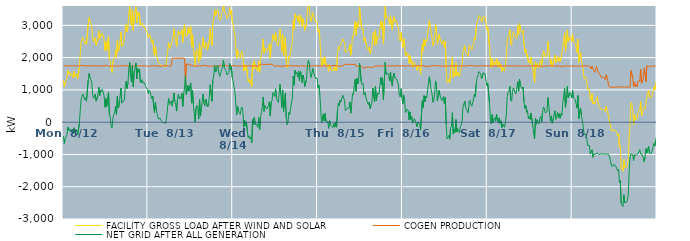
| Category | FACILITY GROSS LOAD AFTER WIND AND SOLAR | COGEN PRODUCTION | NET GRID AFTER ALL GENERATION |
|---|---|---|---|
|  Mon  8/12 | 1309 | 1745 | -436 |
|  Mon  8/12 | 1097 | 1756 | -659 |
|  Mon  8/12 | 1233 | 1739 | -506 |
|  Mon  8/12 | 1297 | 1753 | -456 |
|  Mon  8/12 | 1364 | 1751 | -387 |
|  Mon  8/12 | 1605 | 1754 | -149 |
|  Mon  8/12 | 1485 | 1740 | -255 |
|  Mon  8/12 | 1550 | 1755 | -205 |
|  Mon  8/12 | 1447 | 1754 | -307 |
|  Mon  8/12 | 1504 | 1738 | -234 |
|  Mon  8/12 | 1449 | 1746 | -297 |
|  Mon  8/12 | 1378 | 1738 | -360 |
|  Mon  8/12 | 1574 | 1745 | -171 |
|  Mon  8/12 | 1402 | 1738 | -336 |
|  Mon  8/12 | 1396 | 1743 | -347 |
|  Mon  8/12 | 1507 | 1741 | -234 |
|  Mon  8/12 | 1344 | 1742 | -398 |
|  Mon  8/12 | 1372 | 1745 | -373 |
|  Mon  8/12 | 1685 | 1742 | -57 |
|  Mon  8/12 | 2113 | 1745 | 368 |
|  Mon  8/12 | 2475 | 1762 | 713 |
|  Mon  8/12 | 2449 | 1757 | 692 |
|  Mon  8/12 | 2632 | 1756 | 876 |
|  Mon  8/12 | 2552 | 1744 | 808 |
|  Mon  8/12 | 2437 | 1738 | 699 |
|  Mon  8/12 | 2490 | 1735 | 755 |
|  Mon  8/12 | 2401 | 1752 | 649 |
|  Mon  8/12 | 2379 | 1731 | 648 |
|  Mon  8/12 | 3034 | 1739 | 1295 |
|  Mon  8/12 | 3244 | 1734 | 1510 |
|  Mon  8/12 | 3137 | 1745 | 1392 |
|  Mon  8/12 | 3065 | 1751 | 1314 |
|  Mon  8/12 | 2994 | 1746 | 1248 |
|  Mon  8/12 | 2605 | 1740 | 865 |
|  Mon  8/12 | 2485 | 1748 | 737 |
|  Mon  8/12 | 2539 | 1750 | 789 |
|  Mon  8/12 | 2618 | 1748 | 870 |
|  Mon  8/12 | 2380 | 1728 | 652 |
|  Mon  8/12 | 2384 | 1746 | 638 |
|  Mon  8/12 | 2571 | 1748 | 823 |
|  Mon  8/12 | 2830 | 1744 | 1086 |
|  Mon  8/12 | 2575 | 1750 | 825 |
|  Mon  8/12 | 2727 | 1743 | 984 |
|  Mon  8/12 | 2686 | 1746 | 940 |
|  Mon  8/12 | 2759 | 1739 | 1020 |
|  Mon  8/12 | 2764 | 1731 | 1033 |
|  Mon  8/12 | 2559 | 1739 | 820 |
|  Mon  8/12 | 2205 | 1744 | 461 |
|  Mon  8/12 | 2495 | 1763 | 732 |
|  Mon  8/12 | 2234 | 1744 | 490 |
|  Mon  8/12 | 2222 | 1751 | 471 |
|  Mon  8/12 | 2656 | 1740 | 916 |
|  Mon  8/12 | 1949 | 1725 | 224 |
|  Mon  8/12 | 1876 | 1728 | 148 |
|  Mon  8/12 | 1610 | 1751 | -141 |
|  Mon  8/12 | 1544 | 1730 | -186 |
|  Mon  8/12 | 1886 | 1745 | 141 |
|  Mon  8/12 | 1866 | 1750 | 116 |
|  Mon  8/12 | 2042 | 1732 | 310 |
|  Mon  8/12 | 2233 | 1748 | 485 |
|  Mon  8/12 | 1986 | 1743 | 243 |
|  Mon  8/12 | 2533 | 1734 | 799 |
|  Mon  8/12 | 2192 | 1749 | 443 |
|  Mon  8/12 | 2244 | 1735 | 509 |
|  Mon  8/12 | 2218 | 1729 | 489 |
|  Mon  8/12 | 2799 | 1739 | 1060 |
|  Mon  8/12 | 2344 | 1754 | 590 |
|  Mon  8/12 | 2345 | 1733 | 612 |
|  Mon  8/12 | 2407 | 1753 | 654 |
|  Mon  8/12 | 2436 | 1742 | 694 |
|  Mon  8/12 | 2869 | 1737 | 1132 |
|  Mon  8/12 | 3035 | 1761 | 1274 |
|  Mon  8/12 | 2795 | 1749 | 1046 |
|  Mon  8/12 | 2955 | 1733 | 1222 |
|  Mon  8/12 | 3394 | 1743 | 1651 |
|  Mon  8/12 | 3582 | 1733 | 1849 |
|  Mon  8/12 | 3164 | 1749 | 1415 |
|  Mon  8/12 | 2984 | 1741 | 1243 |
|  Mon  8/12 | 3483 | 1732 | 1751 |
|  Mon  8/12 | 2838 | 1742 | 1096 |
|  Mon  8/12 | 3311 | 1746 | 1565 |
|  Mon  8/12 | 3423 | 1740 | 1683 |
|  Mon  8/12 | 3576 | 1740 | 1836 |
|  Mon  8/12 | 3073 | 1734 | 1339 |
|  Mon  8/12 | 3411 | 1748 | 1663 |
|  Mon  8/12 | 3306 | 1755 | 1551 |
|  Mon  8/12 | 3382 | 1737 | 1645 |
|  Mon  8/12 | 2987 | 1742 | 1245 |
|  Mon  8/12 | 2961 | 1747 | 1214 |
|  Mon  8/12 | 3075 | 1759 | 1316 |
|  Mon  8/12 | 2966 | 1751 | 1215 |
|  Mon  8/12 | 2954 | 1743 | 1211 |
|  Mon  8/12 | 2955 | 1742 | 1213 |
|  Mon  8/12 | 2854 | 1751 | 1103 |
|  Mon  8/12 | 2858 | 1740 | 1118 |
|  Mon  8/12 | 2770 | 1749 | 1021 |
|  Tue  8/13 | 2619 | 1727 | 892 |
|  Tue  8/13 | 2721 | 1737 | 984 |
|  Tue  8/13 | 2685 | 1739 | 946 |
|  Tue  8/13 | 2584 | 1752 | 832 |
|  Tue  8/13 | 2469 | 1748 | 721 |
|  Tue  8/13 | 2554 | 1744 | 810 |
|  Tue  8/13 | 2565 | 1750 | 815 |
|  Tue  8/13 | 2044 | 1745 | 299 |
|  Tue  8/13 | 2357 | 1740 | 617 |
|  Tue  8/13 | 2131 | 1741 | 390 |
|  Tue  8/13 | 1985 | 1741 | 244 |
|  Tue  8/13 | 1881 | 1750 | 131 |
|  Tue  8/13 | 1835 | 1741 | 94 |
|  Tue  8/13 | 1865 | 1733 | 132 |
|  Tue  8/13 | 1777 | 1720 | 57 |
|  Tue  8/13 | 1784 | 1741 | 43 |
|  Tue  8/13 | 1758 | 1752 | 6 |
|  Tue  8/13 | 1730 | 1738 | -8 |
|  Tue  8/13 | 1729 | 1748 | -19 |
|  Tue  8/13 | 1735 | 1748 | -13 |
|  Tue  8/13 | 1715 | 1748 | -33 |
|  Tue  8/13 | 1725 | 1744 | -19 |
|  Tue  8/13 | 2248 | 1745 | 503 |
|  Tue  8/13 | 2468 | 1731 | 737 |
|  Tue  8/13 | 2283 | 1734 | 549 |
|  Tue  8/13 | 2360 | 1744 | 616 |
|  Tue  8/13 | 2398 | 1739 | 659 |
|  Tue  8/13 | 2481 | 1983 | 498 |
|  Tue  8/13 | 2653 | 1967 | 686 |
|  Tue  8/13 | 2892 | 1985 | 907 |
|  Tue  8/13 | 2645 | 1993 | 652 |
|  Tue  8/13 | 2520 | 1980 | 540 |
|  Tue  8/13 | 2332 | 1991 | 341 |
|  Tue  8/13 | 2686 | 1986 | 700 |
|  Tue  8/13 | 2833 | 1974 | 859 |
|  Tue  8/13 | 2720 | 1981 | 739 |
|  Tue  8/13 | 2770 | 1989 | 781 |
|  Tue  8/13 | 2718 | 1991 | 727 |
|  Tue  8/13 | 2874 | 1979 | 895 |
|  Tue  8/13 | 2472 | 1984 | 488 |
|  Tue  8/13 | 2847 | 1972 | 875 |
|  Tue  8/13 | 3035 | 1975 | 1060 |
|  Tue  8/13 | 2667 | 1232 | 1435 |
|  Tue  8/13 | 2653 | 1800 | 853 |
|  Tue  8/13 | 2672 | 1796 | 876 |
|  Tue  8/13 | 2928 | 1792 | 1136 |
|  Tue  8/13 | 2751 | 1787 | 964 |
|  Tue  8/13 | 2912 | 1797 | 1115 |
|  Tue  8/13 | 2965 | 1747 | 1218 |
|  Tue  8/13 | 2332 | 1743 | 589 |
|  Tue  8/13 | 2733 | 1749 | 984 |
|  Tue  8/13 | 2294 | 1746 | 548 |
|  Tue  8/13 | 2318 | 1741 | 577 |
|  Tue  8/13 | 1747 | 1743 | 4 |
|  Tue  8/13 | 2167 | 1732 | 435 |
|  Tue  8/13 | 2255 | 1740 | 515 |
|  Tue  8/13 | 2197 | 1744 | 453 |
|  Tue  8/13 | 1843 | 1746 | 97 |
|  Tue  8/13 | 2448 | 1744 | 704 |
|  Tue  8/13 | 1928 | 1742 | 186 |
|  Tue  8/13 | 2187 | 1748 | 439 |
|  Tue  8/13 | 2388 | 1750 | 638 |
|  Tue  8/13 | 2622 | 1747 | 875 |
|  Tue  8/13 | 2322 | 1747 | 575 |
|  Tue  8/13 | 2281 | 1771 | 510 |
|  Tue  8/13 | 2474 | 1758 | 716 |
|  Tue  8/13 | 2443 | 1740 | 703 |
|  Tue  8/13 | 2230 | 1760 | 470 |
|  Tue  8/13 | 2243 | 1734 | 509 |
|  Tue  8/13 | 2540 | 1750 | 790 |
|  Tue  8/13 | 2900 | 1738 | 1162 |
|  Tue  8/13 | 2902 | 1750 | 1152 |
|  Tue  8/13 | 2378 | 1729 | 649 |
|  Tue  8/13 | 3051 | 1752 | 1299 |
|  Tue  8/13 | 3210 | 1748 | 1462 |
|  Tue  8/13 | 3495 | 1734 | 1761 |
|  Tue  8/13 | 3290 | 1738 | 1552 |
|  Tue  8/13 | 3340 | 1757 | 1583 |
|  Tue  8/13 | 3494 | 1729 | 1765 |
|  Tue  8/13 | 3450 | 1737 | 1713 |
|  Tue  8/13 | 3223 | 1746 | 1477 |
|  Tue  8/13 | 3157 | 1741 | 1416 |
|  Tue  8/13 | 3193 | 1758 | 1435 |
|  Tue  8/13 | 3364 | 1735 | 1629 |
|  Tue  8/13 | 3427 | 1737 | 1690 |
|  Tue  8/13 | 3666 | 1744 | 1922 |
|  Tue  8/13 | 3457 | 1762 | 1695 |
|  Tue  8/13 | 3388 | 1751 | 1637 |
|  Tue  8/13 | 3332 | 1749 | 1583 |
|  Tue  8/13 | 3199 | 1735 | 1464 |
|  Tue  8/13 | 3217 | 1747 | 1470 |
|  Tue  8/13 | 3281 | 1749 | 1532 |
|  Tue  8/13 | 3554 | 1739 | 1815 |
|  Tue  8/13 | 3346 | 1730 | 1616 |
|  Tue  8/13 | 3476 | 1744 | 1732 |
|  Tue  8/13 | 3111 | 1739 | 1372 |
|  Wed  8/14 | 3019 | 1753 | 1266 |
|  Wed  8/14 | 2822 | 1734 | 1088 |
|  Wed  8/14 | 2678 | 1750 | 928 |
|  Wed  8/14 | 2311 | 1736 | 575 |
|  Wed  8/14 | 1970 | 1739 | 231 |
|  Wed  8/14 | 2256 | 1752 | 504 |
|  Wed  8/14 | 2086 | 1736 | 350 |
|  Wed  8/14 | 2038 | 1742 | 296 |
|  Wed  8/14 | 1988 | 1746 | 242 |
|  Wed  8/14 | 2155 | 1738 | 417 |
|  Wed  8/14 | 2201 | 1735 | 466 |
|  Wed  8/14 | 2063 | 1726 | 337 |
|  Wed  8/14 | 1582 | 1738 | -156 |
|  Wed  8/14 | 1790 | 1738 | 52 |
|  Wed  8/14 | 1629 | 1749 | -120 |
|  Wed  8/14 | 1747 | 1739 | 8 |
|  Wed  8/14 | 1463 | 1741 | -278 |
|  Wed  8/14 | 1253 | 1725 | -472 |
|  Wed  8/14 | 1328 | 1750 | -422 |
|  Wed  8/14 | 1216 | 1729 | -513 |
|  Wed  8/14 | 1288 | 1748 | -460 |
|  Wed  8/14 | 1089 | 1736 | -647 |
|  Wed  8/14 | 1815 | 1726 | 89 |
|  Wed  8/14 | 1625 | 1713 | -88 |
|  Wed  8/14 | 1908 | 1749 | 159 |
|  Wed  8/14 | 1651 | 1735 | -84 |
|  Wed  8/14 | 1693 | 1741 | -48 |
|  Wed  8/14 | 1710 | 1737 | -27 |
|  Wed  8/14 | 1570 | 1731 | -161 |
|  Wed  8/14 | 1887 | 1746 | 141 |
|  Wed  8/14 | 1543 | 1776 | -233 |
|  Wed  8/14 | 1939 | 1781 | 158 |
|  Wed  8/14 | 2107 | 1803 | 304 |
|  Wed  8/14 | 2282 | 1797 | 485 |
|  Wed  8/14 | 2572 | 1790 | 782 |
|  Wed  8/14 | 2135 | 1800 | 335 |
|  Wed  8/14 | 2297 | 1783 | 514 |
|  Wed  8/14 | 2325 | 1807 | 518 |
|  Wed  8/14 | 2198 | 1795 | 403 |
|  Wed  8/14 | 2169 | 1786 | 383 |
|  Wed  8/14 | 2316 | 1790 | 526 |
|  Wed  8/14 | 2423 | 1789 | 634 |
|  Wed  8/14 | 1985 | 1796 | 189 |
|  Wed  8/14 | 2423 | 1801 | 622 |
|  Wed  8/14 | 2469 | 1792 | 677 |
|  Wed  8/14 | 2712 | 1790 | 922 |
|  Wed  8/14 | 2699 | 1757 | 942 |
|  Wed  8/14 | 2523 | 1725 | 798 |
|  Wed  8/14 | 2778 | 1746 | 1032 |
|  Wed  8/14 | 2500 | 1749 | 751 |
|  Wed  8/14 | 2410 | 1742 | 668 |
|  Wed  8/14 | 2363 | 1749 | 614 |
|  Wed  8/14 | 2362 | 1741 | 621 |
|  Wed  8/14 | 2891 | 1721 | 1170 |
|  Wed  8/14 | 2608 | 1748 | 860 |
|  Wed  8/14 | 2196 | 1739 | 457 |
|  Wed  8/14 | 2732 | 1733 | 999 |
|  Wed  8/14 | 2070 | 1741 | 329 |
|  Wed  8/14 | 2388 | 1750 | 638 |
|  Wed  8/14 | 2637 | 1738 | 899 |
|  Wed  8/14 | 1895 | 1749 | 146 |
|  Wed  8/14 | 1678 | 1750 | -72 |
|  Wed  8/14 | 1751 | 1752 | -1 |
|  Wed  8/14 | 2052 | 1750 | 302 |
|  Wed  8/14 | 1991 | 1750 | 241 |
|  Wed  8/14 | 1977 | 1740 | 237 |
|  Wed  8/14 | 2350 | 1747 | 603 |
|  Wed  8/14 | 2499 | 1749 | 750 |
|  Wed  8/14 | 3168 | 1744 | 1424 |
|  Wed  8/14 | 2877 | 1736 | 1141 |
|  Wed  8/14 | 3357 | 1754 | 1603 |
|  Wed  8/14 | 3247 | 1747 | 1500 |
|  Wed  8/14 | 3285 | 1740 | 1545 |
|  Wed  8/14 | 3143 | 1738 | 1405 |
|  Wed  8/14 | 3319 | 1739 | 1580 |
|  Wed  8/14 | 3025 | 1737 | 1288 |
|  Wed  8/14 | 3318 | 1743 | 1575 |
|  Wed  8/14 | 3232 | 1747 | 1485 |
|  Wed  8/14 | 2955 | 1733 | 1222 |
|  Wed  8/14 | 3205 | 1743 | 1462 |
|  Wed  8/14 | 3083 | 1739 | 1344 |
|  Wed  8/14 | 2841 | 1737 | 1104 |
|  Wed  8/14 | 2858 | 1744 | 1114 |
|  Wed  8/14 | 3063 | 1733 | 1330 |
|  Wed  8/14 | 3476 | 1727 | 1749 |
|  Wed  8/14 | 3652 | 1736 | 1916 |
|  Wed  8/14 | 3555 | 1739 | 1816 |
|  Wed  8/14 | 3318 | 1748 | 1570 |
|  Wed  8/14 | 3122 | 1734 | 1388 |
|  Wed  8/14 | 3225 | 1747 | 1478 |
|  Wed  8/14 | 3390 | 1731 | 1659 |
|  Wed  8/14 | 3296 | 1739 | 1557 |
|  Wed  8/14 | 3285 | 1753 | 1532 |
|  Wed  8/14 | 3112 | 1753 | 1359 |
|  Wed  8/14 | 3122 | 1743 | 1379 |
|  Wed  8/14 | 3114 | 1749 | 1365 |
|  Thu  8/15 | 2813 | 1743 | 1070 |
|  Thu  8/15 | 2887 | 1737 | 1150 |
|  Thu  8/15 | 2614 | 1738 | 876 |
|  Thu  8/15 | 2616 | 1745 | 871 |
|  Thu  8/15 | 1704 | 1731 | -27 |
|  Thu  8/15 | 1734 | 1732 | 2 |
|  Thu  8/15 | 1996 | 1754 | 242 |
|  Thu  8/15 | 1798 | 1757 | 41 |
|  Thu  8/15 | 2024 | 1751 | 273 |
|  Thu  8/15 | 1771 | 1737 | 34 |
|  Thu  8/15 | 1737 | 1742 | -5 |
|  Thu  8/15 | 1775 | 1743 | 32 |
|  Thu  8/15 | 1560 | 1751 | -191 |
|  Thu  8/15 | 1793 | 1744 | 49 |
|  Thu  8/15 | 1672 | 1735 | -63 |
|  Thu  8/15 | 1614 | 1736 | -122 |
|  Thu  8/15 | 1632 | 1752 | -120 |
|  Thu  8/15 | 1591 | 1755 | -164 |
|  Thu  8/15 | 1704 | 1741 | -37 |
|  Thu  8/15 | 1600 | 1755 | -155 |
|  Thu  8/15 | 1732 | 1741 | -9 |
|  Thu  8/15 | 1591 | 1747 | -156 |
|  Thu  8/15 | 2077 | 1735 | 342 |
|  Thu  8/15 | 2326 | 1740 | 586 |
|  Thu  8/15 | 2252 | 1742 | 510 |
|  Thu  8/15 | 2407 | 1723 | 684 |
|  Thu  8/15 | 2377 | 1742 | 635 |
|  Thu  8/15 | 2496 | 1747 | 749 |
|  Thu  8/15 | 2584 | 1748 | 836 |
|  Thu  8/15 | 2571 | 1752 | 819 |
|  Thu  8/15 | 2461 | 1797 | 664 |
|  Thu  8/15 | 2156 | 1798 | 358 |
|  Thu  8/15 | 2165 | 1786 | 379 |
|  Thu  8/15 | 2219 | 1794 | 425 |
|  Thu  8/15 | 2213 | 1799 | 414 |
|  Thu  8/15 | 2242 | 1796 | 446 |
|  Thu  8/15 | 2411 | 1785 | 626 |
|  Thu  8/15 | 2074 | 1795 | 279 |
|  Thu  8/15 | 2309 | 1794 | 515 |
|  Thu  8/15 | 2668 | 1786 | 882 |
|  Thu  8/15 | 2631 | 1784 | 847 |
|  Thu  8/15 | 2909 | 1786 | 1123 |
|  Thu  8/15 | 3128 | 1797 | 1331 |
|  Thu  8/15 | 2697 | 1737 | 960 |
|  Thu  8/15 | 3093 | 1731 | 1362 |
|  Thu  8/15 | 2920 | 1734 | 1186 |
|  Thu  8/15 | 3039 | 1751 | 1288 |
|  Thu  8/15 | 3579 | 1746 | 1833 |
|  Thu  8/15 | 3568 | 1751 | 1817 |
|  Thu  8/15 | 2979 | 1739 | 1240 |
|  Thu  8/15 | 2863 | 1701 | 1162 |
|  Thu  8/15 | 2901 | 1697 | 1204 |
|  Thu  8/15 | 2520 | 1675 | 845 |
|  Thu  8/15 | 2614 | 1692 | 922 |
|  Thu  8/15 | 2636 | 1694 | 942 |
|  Thu  8/15 | 2364 | 1686 | 678 |
|  Thu  8/15 | 2385 | 1701 | 684 |
|  Thu  8/15 | 2231 | 1689 | 542 |
|  Thu  8/15 | 2328 | 1705 | 623 |
|  Thu  8/15 | 2123 | 1700 | 423 |
|  Thu  8/15 | 2212 | 1695 | 517 |
|  Thu  8/15 | 2320 | 1694 | 626 |
|  Thu  8/15 | 2752 | 1694 | 1058 |
|  Thu  8/15 | 2794 | 1726 | 1068 |
|  Thu  8/15 | 2385 | 1752 | 633 |
|  Thu  8/15 | 2847 | 1736 | 1111 |
|  Thu  8/15 | 2401 | 1734 | 667 |
|  Thu  8/15 | 2632 | 1741 | 891 |
|  Thu  8/15 | 2606 | 1736 | 870 |
|  Thu  8/15 | 2611 | 1740 | 871 |
|  Thu  8/15 | 2878 | 1741 | 1137 |
|  Thu  8/15 | 3131 | 1742 | 1389 |
|  Thu  8/15 | 2911 | 1753 | 1158 |
|  Thu  8/15 | 3114 | 1742 | 1372 |
|  Thu  8/15 | 2421 | 1730 | 691 |
|  Thu  8/15 | 2977 | 1742 | 1235 |
|  Thu  8/15 | 3590 | 1734 | 1856 |
|  Thu  8/15 | 3231 | 1747 | 1484 |
|  Thu  8/15 | 3239 | 1737 | 1502 |
|  Thu  8/15 | 3262 | 1743 | 1519 |
|  Thu  8/15 | 3175 | 1731 | 1444 |
|  Thu  8/15 | 3022 | 1743 | 1279 |
|  Thu  8/15 | 3298 | 1748 | 1550 |
|  Thu  8/15 | 3004 | 1748 | 1256 |
|  Thu  8/15 | 2863 | 1744 | 1119 |
|  Thu  8/15 | 3162 | 1750 | 1412 |
|  Thu  8/15 | 3270 | 1751 | 1519 |
|  Thu  8/15 | 3105 | 1729 | 1376 |
|  Thu  8/15 | 3154 | 1753 | 1401 |
|  Thu  8/15 | 3092 | 1754 | 1338 |
|  Thu  8/15 | 3101 | 1744 | 1357 |
|  Thu  8/15 | 2895 | 1752 | 1143 |
|  Thu  8/15 | 2552 | 1724 | 828 |
|  Thu  8/15 | 2509 | 1728 | 781 |
|  Thu  8/15 | 2794 | 1753 | 1041 |
|  Thu  8/15 | 2508 | 1754 | 754 |
|  Fri  8/16 | 2317 | 1749 | 568 |
|  Fri  8/16 | 2587 | 1754 | 833 |
|  Fri  8/16 | 2409 | 1736 | 673 |
|  Fri  8/16 | 2029 | 1727 | 302 |
|  Fri  8/16 | 2019 | 1734 | 285 |
|  Fri  8/16 | 2151 | 1746 | 405 |
|  Fri  8/16 | 2106 | 1743 | 363 |
|  Fri  8/16 | 1821 | 1751 | 70 |
|  Fri  8/16 | 2057 | 1738 | 319 |
|  Fri  8/16 | 1832 | 1742 | 90 |
|  Fri  8/16 | 1913 | 1744 | 169 |
|  Fri  8/16 | 1705 | 1735 | -30 |
|  Fri  8/16 | 1768 | 1749 | 19 |
|  Fri  8/16 | 1854 | 1742 | 112 |
|  Fri  8/16 | 1873 | 1744 | 129 |
|  Fri  8/16 | 1709 | 1751 | -42 |
|  Fri  8/16 | 1605 | 1746 | -141 |
|  Fri  8/16 | 1762 | 1754 | 8 |
|  Fri  8/16 | 1712 | 1740 | -28 |
|  Fri  8/16 | 1662 | 1742 | -80 |
|  Fri  8/16 | 1480 | 1729 | -249 |
|  Fri  8/16 | 1500 | 1742 | -242 |
|  Fri  8/16 | 2415 | 1745 | 670 |
|  Fri  8/16 | 2213 | 1757 | 456 |
|  Fri  8/16 | 2571 | 1749 | 822 |
|  Fri  8/16 | 2358 | 1728 | 630 |
|  Fri  8/16 | 2545 | 1738 | 807 |
|  Fri  8/16 | 2492 | 1733 | 759 |
|  Fri  8/16 | 2511 | 1751 | 760 |
|  Fri  8/16 | 2966 | 1725 | 1241 |
|  Fri  8/16 | 3149 | 1738 | 1411 |
|  Fri  8/16 | 2946 | 1738 | 1208 |
|  Fri  8/16 | 2756 | 1752 | 1004 |
|  Fri  8/16 | 2630 | 1754 | 876 |
|  Fri  8/16 | 2364 | 1744 | 620 |
|  Fri  8/16 | 2445 | 1749 | 696 |
|  Fri  8/16 | 2674 | 1754 | 920 |
|  Fri  8/16 | 3032 | 1750 | 1282 |
|  Fri  8/16 | 2867 | 1741 | 1126 |
|  Fri  8/16 | 2410 | 1756 | 654 |
|  Fri  8/16 | 2568 | 1730 | 838 |
|  Fri  8/16 | 2728 | 1735 | 993 |
|  Fri  8/16 | 2581 | 1748 | 833 |
|  Fri  8/16 | 2479 | 1738 | 741 |
|  Fri  8/16 | 2415 | 1746 | 669 |
|  Fri  8/16 | 2468 | 1739 | 729 |
|  Fri  8/16 | 2534 | 1739 | 795 |
|  Fri  8/16 | 2320 | 1743 | 577 |
|  Fri  8/16 | 2507 | 1744 | 763 |
|  Fri  8/16 | 1662 | 1736 | -74 |
|  Fri  8/16 | 1219 | 1735 | -516 |
|  Fri  8/16 | 1258 | 1739 | -481 |
|  Fri  8/16 | 1323 | 1731 | -408 |
|  Fri  8/16 | 1214 | 1743 | -529 |
|  Fri  8/16 | 1593 | 1755 | -162 |
|  Fri  8/16 | 1620 | 1745 | -125 |
|  Fri  8/16 | 2026 | 1731 | 295 |
|  Fri  8/16 | 1376 | 1746 | -370 |
|  Fri  8/16 | 1525 | 1747 | -222 |
|  Fri  8/16 | 1434 | 1748 | -314 |
|  Fri  8/16 | 1835 | 1755 | 80 |
|  Fri  8/16 | 1440 | 1742 | -302 |
|  Fri  8/16 | 1554 | 1749 | -195 |
|  Fri  8/16 | 1452 | 1741 | -289 |
|  Fri  8/16 | 1408 | 1740 | -332 |
|  Fri  8/16 | 1604 | 1741 | -137 |
|  Fri  8/16 | 1666 | 1747 | -81 |
|  Fri  8/16 | 1788 | 1748 | 40 |
|  Fri  8/16 | 2213 | 1737 | 476 |
|  Fri  8/16 | 2212 | 1745 | 467 |
|  Fri  8/16 | 2370 | 1717 | 653 |
|  Fri  8/16 | 2183 | 1729 | 454 |
|  Fri  8/16 | 2144 | 1738 | 406 |
|  Fri  8/16 | 2145 | 1755 | 390 |
|  Fri  8/16 | 2033 | 1741 | 292 |
|  Fri  8/16 | 2388 | 1748 | 640 |
|  Fri  8/16 | 2408 | 1733 | 675 |
|  Fri  8/16 | 2289 | 1755 | 534 |
|  Fri  8/16 | 2236 | 1741 | 495 |
|  Fri  8/16 | 2248 | 1747 | 501 |
|  Fri  8/16 | 2463 | 1742 | 721 |
|  Fri  8/16 | 2618 | 1744 | 874 |
|  Fri  8/16 | 2544 | 1755 | 789 |
|  Fri  8/16 | 2937 | 1744 | 1193 |
|  Fri  8/16 | 3134 | 1749 | 1385 |
|  Fri  8/16 | 3169 | 1734 | 1435 |
|  Fri  8/16 | 3305 | 1737 | 1568 |
|  Fri  8/16 | 3325 | 1742 | 1583 |
|  Fri  8/16 | 3249 | 1745 | 1504 |
|  Fri  8/16 | 3099 | 1752 | 1347 |
|  Fri  8/16 | 3099 | 1732 | 1367 |
|  Fri  8/16 | 3266 | 1739 | 1527 |
|  Fri  8/16 | 3278 | 1751 | 1527 |
|  Fri  8/16 | 3249 | 1744 | 1505 |
|  Fri  8/16 | 3256 | 1750 | 1506 |
|  Fri  8/16 | 2870 | 1746 | 1124 |
|  Sat  8/17 | 2951 | 1745 | 1206 |
|  Sat  8/17 | 2973 | 1748 | 1225 |
|  Sat  8/17 | 2330 | 1741 | 589 |
|  Sat  8/17 | 1853 | 1744 | 109 |
|  Sat  8/17 | 1687 | 1741 | -54 |
|  Sat  8/17 | 1980 | 1744 | 236 |
|  Sat  8/17 | 1746 | 1756 | -10 |
|  Sat  8/17 | 1831 | 1739 | 92 |
|  Sat  8/17 | 1886 | 1744 | 142 |
|  Sat  8/17 | 1768 | 1738 | 30 |
|  Sat  8/17 | 1982 | 1742 | 240 |
|  Sat  8/17 | 1813 | 1738 | 75 |
|  Sat  8/17 | 1716 | 1735 | -19 |
|  Sat  8/17 | 1879 | 1746 | 133 |
|  Sat  8/17 | 1697 | 1739 | -42 |
|  Sat  8/17 | 1791 | 1747 | 44 |
|  Sat  8/17 | 1580 | 1746 | -166 |
|  Sat  8/17 | 1692 | 1745 | -53 |
|  Sat  8/17 | 1712 | 1737 | -25 |
|  Sat  8/17 | 1583 | 1742 | -159 |
|  Sat  8/17 | 1757 | 1743 | 14 |
|  Sat  8/17 | 1963 | 1745 | 218 |
|  Sat  8/17 | 2550 | 1749 | 801 |
|  Sat  8/17 | 2663 | 1742 | 921 |
|  Sat  8/17 | 2695 | 1738 | 957 |
|  Sat  8/17 | 2868 | 1747 | 1121 |
|  Sat  8/17 | 2420 | 1729 | 691 |
|  Sat  8/17 | 2388 | 1743 | 645 |
|  Sat  8/17 | 2698 | 1742 | 956 |
|  Sat  8/17 | 2801 | 1737 | 1064 |
|  Sat  8/17 | 2781 | 1745 | 1036 |
|  Sat  8/17 | 2660 | 1745 | 915 |
|  Sat  8/17 | 2616 | 1740 | 876 |
|  Sat  8/17 | 2583 | 1735 | 848 |
|  Sat  8/17 | 2999 | 1747 | 1252 |
|  Sat  8/17 | 2710 | 1749 | 961 |
|  Sat  8/17 | 3067 | 1738 | 1329 |
|  Sat  8/17 | 2887 | 1736 | 1151 |
|  Sat  8/17 | 2814 | 1731 | 1083 |
|  Sat  8/17 | 2768 | 1742 | 1026 |
|  Sat  8/17 | 2837 | 1747 | 1090 |
|  Sat  8/17 | 2370 | 1740 | 630 |
|  Sat  8/17 | 2173 | 1742 | 431 |
|  Sat  8/17 | 2261 | 1740 | 521 |
|  Sat  8/17 | 2034 | 1728 | 306 |
|  Sat  8/17 | 2116 | 1754 | 362 |
|  Sat  8/17 | 1853 | 1738 | 115 |
|  Sat  8/17 | 1925 | 1745 | 180 |
|  Sat  8/17 | 1826 | 1740 | 86 |
|  Sat  8/17 | 2012 | 1730 | 282 |
|  Sat  8/17 | 2004 | 1734 | 270 |
|  Sat  8/17 | 1622 | 1753 | -131 |
|  Sat  8/17 | 1388 | 1755 | -367 |
|  Sat  8/17 | 1230 | 1749 | -519 |
|  Sat  8/17 | 1871 | 1743 | 128 |
|  Sat  8/17 | 1675 | 1745 | -70 |
|  Sat  8/17 | 1817 | 1741 | 76 |
|  Sat  8/17 | 1821 | 1748 | 73 |
|  Sat  8/17 | 1682 | 1737 | -55 |
|  Sat  8/17 | 1857 | 1733 | 124 |
|  Sat  8/17 | 1911 | 1736 | 175 |
|  Sat  8/17 | 1733 | 1738 | -5 |
|  Sat  8/17 | 2051 | 1746 | 305 |
|  Sat  8/17 | 2204 | 1730 | 474 |
|  Sat  8/17 | 2174 | 1742 | 432 |
|  Sat  8/17 | 2031 | 1743 | 288 |
|  Sat  8/17 | 2052 | 1743 | 309 |
|  Sat  8/17 | 2055 | 1737 | 318 |
|  Sat  8/17 | 2505 | 1744 | 761 |
|  Sat  8/17 | 2260 | 1744 | 516 |
|  Sat  8/17 | 2264 | 1748 | 516 |
|  Sat  8/17 | 1797 | 1759 | 38 |
|  Sat  8/17 | 1941 | 1747 | 194 |
|  Sat  8/17 | 1710 | 1745 | -35 |
|  Sat  8/17 | 1830 | 1738 | 92 |
|  Sat  8/17 | 1811 | 1740 | 71 |
|  Sat  8/17 | 2082 | 1730 | 352 |
|  Sat  8/17 | 1833 | 1743 | 90 |
|  Sat  8/17 | 1919 | 1758 | 161 |
|  Sat  8/17 | 2039 | 1741 | 298 |
|  Sat  8/17 | 1894 | 1745 | 149 |
|  Sat  8/17 | 1998 | 1737 | 261 |
|  Sat  8/17 | 1867 | 1746 | 121 |
|  Sat  8/17 | 1990 | 1724 | 266 |
|  Sat  8/17 | 1962 | 1749 | 213 |
|  Sat  8/17 | 2352 | 1743 | 609 |
|  Sat  8/17 | 2567 | 1747 | 820 |
|  Sat  8/17 | 2771 | 1731 | 1040 |
|  Sat  8/17 | 2180 | 1730 | 450 |
|  Sat  8/17 | 2490 | 1747 | 743 |
|  Sat  8/17 | 2857 | 1748 | 1109 |
|  Sat  8/17 | 2492 | 1740 | 752 |
|  Sat  8/17 | 2513 | 1747 | 766 |
|  Sat  8/17 | 2641 | 1727 | 914 |
|  Sat  8/17 | 2594 | 1735 | 859 |
|  Sat  8/17 | 2498 | 1746 | 752 |
|  Sun  8/18 | 2730 | 1743 | 987 |
|  Sun  8/18 | 2492 | 1739 | 753 |
|  Sun  8/18 | 2510 | 1743 | 767 |
|  Sun  8/18 | 2434 | 1736 | 698 |
|  Sun  8/18 | 2432 | 1747 | 685 |
|  Sun  8/18 | 2161 | 1726 | 435 |
|  Sun  8/18 | 2576 | 1751 | 825 |
|  Sun  8/18 | 1850 | 1745 | 105 |
|  Sun  8/18 | 1834 | 1733 | 101 |
|  Sun  8/18 | 2170 | 1729 | 441 |
|  Sun  8/18 | 1945 | 1742 | 203 |
|  Sun  8/18 | 1949 | 1744 | 205 |
|  Sun  8/18 | 1610 | 1742 | -132 |
|  Sun  8/18 | 1362 | 1747 | -385 |
|  Sun  8/18 | 1335 | 1732 | -397 |
|  Sun  8/18 | 1388 | 1753 | -365 |
|  Sun  8/18 | 1272 | 1747 | -475 |
|  Sun  8/18 | 1012 | 1733 | -721 |
|  Sun  8/18 | 989 | 1734 | -745 |
|  Sun  8/18 | 1021 | 1742 | -721 |
|  Sun  8/18 | 714 | 1705 | -991 |
|  Sun  8/18 | 663 | 1651 | -988 |
|  Sun  8/18 | 885 | 1743 | -858 |
|  Sun  8/18 | 567 | 1655 | -1088 |
|  Sun  8/18 | 625 | 1615 | -990 |
|  Sun  8/18 | 556 | 1544 | -988 |
|  Sun  8/18 | 539 | 1529 | -990 |
|  Sun  8/18 | 733 | 1736 | -1003 |
|  Sun  8/18 | 789 | 1743 | -954 |
|  Sun  8/18 | 551 | 1525 | -974 |
|  Sun  8/18 | 491 | 1501 | -1010 |
|  Sun  8/18 | 507 | 1484 | -977 |
|  Sun  8/18 | 396 | 1397 | -1001 |
|  Sun  8/18 | 398 | 1389 | -991 |
|  Sun  8/18 | 396 | 1393 | -997 |
|  Sun  8/18 | 394 | 1378 | -984 |
|  Sun  8/18 | 392 | 1383 | -991 |
|  Sun  8/18 | 330 | 1320 | -990 |
|  Sun  8/18 | 500 | 1473 | -973 |
|  Sun  8/18 | 389 | 1379 | -990 |
|  Sun  8/18 | 275 | 1263 | -988 |
|  Sun  8/18 | 107 | 1105 | -998 |
|  Sun  8/18 | 83 | 1092 | -1009 |
|  Sun  8/18 | -121 | 1086 | -1207 |
|  Sun  8/18 | -261 | 1095 | -1356 |
|  Sun  8/18 | -261 | 1082 | -1343 |
|  Sun  8/18 | -264 | 1092 | -1356 |
|  Sun  8/18 | -221 | 1082 | -1303 |
|  Sun  8/18 | -240 | 1091 | -1331 |
|  Sun  8/18 | -285 | 1092 | -1377 |
|  Sun  8/18 | -305 | 1086 | -1391 |
|  Sun  8/18 | -422 | 1083 | -1505 |
|  Sun  8/18 | -353 | 1104 | -1457 |
|  Sun  8/18 | -772 | 1100 | -1872 |
|  Sun  8/18 | -725 | 1086 | -1811 |
|  Sun  8/18 | -1443 | 1083 | -2526 |
|  Sun  8/18 | -1409 | 1091 | -2500 |
|  Sun  8/18 | -1519 | 1099 | -2618 |
|  Sun  8/18 | -1157 | 1091 | -2248 |
|  Sun  8/18 | -1402 | 1092 | -2494 |
|  Sun  8/18 | -1428 | 1094 | -2522 |
|  Sun  8/18 | -1393 | 1089 | -2482 |
|  Sun  8/18 | -1331 | 1098 | -2429 |
|  Sun  8/18 | -1130 | 1090 | -2220 |
|  Sun  8/18 | -463 | 1090 | -1553 |
|  Sun  8/18 | -11 | 1077 | -1088 |
|  Sun  8/18 | 613 | 1594 | -981 |
|  Sun  8/18 | 578 | 1569 | -991 |
|  Sun  8/18 | 389 | 1390 | -1001 |
|  Sun  8/18 | -87 | 1101 | -1188 |
|  Sun  8/18 | 239 | 1243 | -1004 |
|  Sun  8/18 | 79 | 1104 | -1025 |
|  Sun  8/18 | 139 | 1163 | -1024 |
|  Sun  8/18 | 96 | 1098 | -1002 |
|  Sun  8/18 | 296 | 1273 | -977 |
|  Sun  8/18 | 273 | 1269 | -996 |
|  Sun  8/18 | 423 | 1274 | -851 |
|  Sun  8/18 | 649 | 1636 | -987 |
|  Sun  8/18 | 191 | 1207 | -1016 |
|  Sun  8/18 | 273 | 1280 | -1007 |
|  Sun  8/18 | 364 | 1346 | -982 |
|  Sun  8/18 | 452 | 1679 | -1227 |
|  Sun  8/18 | 413 | 1485 | -1072 |
|  Sun  8/18 | 441 | 1255 | -814 |
|  Sun  8/18 | 780 | 1739 | -959 |
|  Sun  8/18 | 894 | 1741 | -847 |
|  Sun  8/18 | 983 | 1732 | -749 |
|  Sun  8/18 | 772 | 1738 | -966 |
|  Sun  8/18 | 755 | 1729 | -974 |
|  Sun  8/18 | 758 | 1735 | -977 |
|  Sun  8/18 | 834 | 1727 | -893 |
|  Sun  8/18 | 826 | 1731 | -905 |
|  Sun  8/18 | 1092 | 1750 | -658 |
|  Sun  8/18 | 997 | 1739 | -742 |
|  Sun  8/18 | 1171 | 1740 | -569 |
|  Sun  8/18 | 1317 | 1743 | -426 |